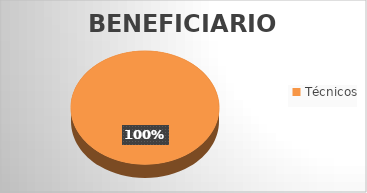
| Category | Técnicos |
|---|---|
| 0 | 97 |